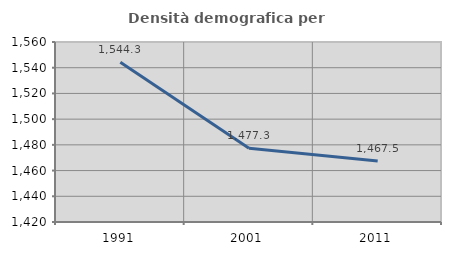
| Category | Densità demografica |
|---|---|
| 1991.0 | 1544.293 |
| 2001.0 | 1477.339 |
| 2011.0 | 1467.521 |